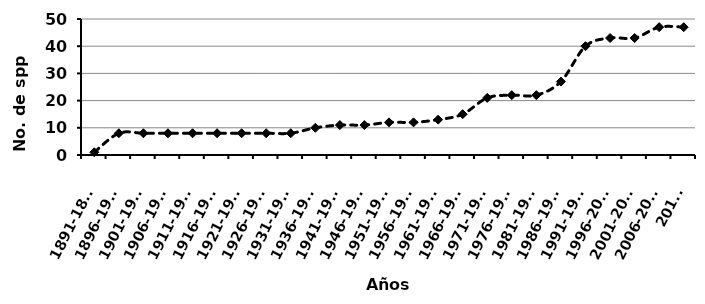
| Category | Series 0 |
|---|---|
| 1891-1895 | 1 |
| 1896-1900 | 8 |
| 1901-1905 | 8 |
| 1906-1910 | 8 |
| 1911-1915 | 8 |
| 1916-1920 | 8 |
| 1921-1925 | 8 |
| 1926-1930 | 8 |
| 1931-1935 | 8 |
| 1936-1940 | 10 |
| 1941-1945 | 11 |
| 1946-1950 | 11 |
| 1951-1955 | 12 |
| 1956-1960 | 12 |
| 1961-1965 | 13 |
| 1966-1970 | 15 |
| 1971-1975 | 21 |
| 1976-1980 | 22 |
| 1981-1985 | 22 |
| 1986-1990 | 27 |
| 1991-1995 | 40 |
| 1996-2000 | 43 |
| 2001-2005 | 43 |
| 2006-2010 | 47 |
| 2011- | 47 |